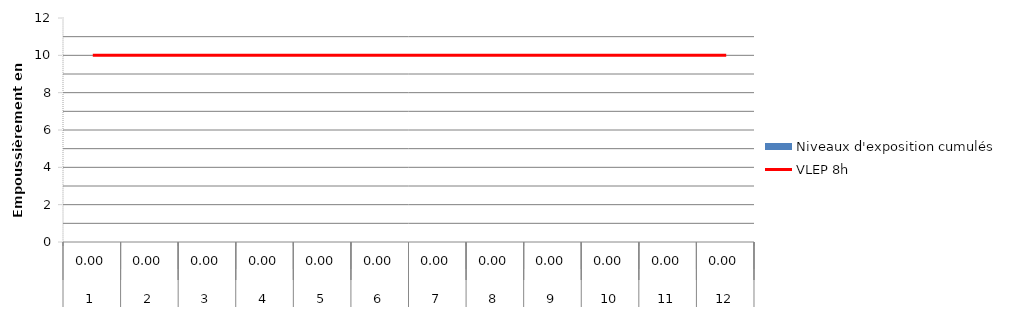
| Category | VLEP 8h |
|---|---|
| 0 | 10 |
| 1 | 10 |
| 2 | 10 |
| 3 | 10 |
| 4 | 10 |
| 5 | 10 |
| 6 | 10 |
| 7 | 10 |
| 8 | 10 |
| 9 | 10 |
| 10 | 10 |
| 11 | 10 |